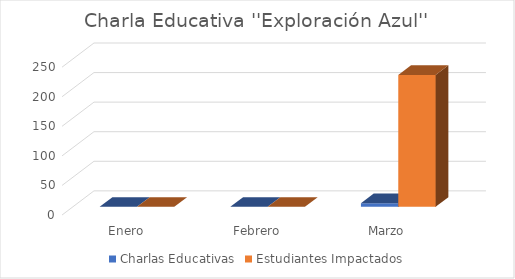
| Category | Charlas Educativas | Estudiantes Impactados |
|---|---|---|
| Enero | 0 | 0 |
| Febrero | 0 | 0 |
| Marzo | 6 | 223 |